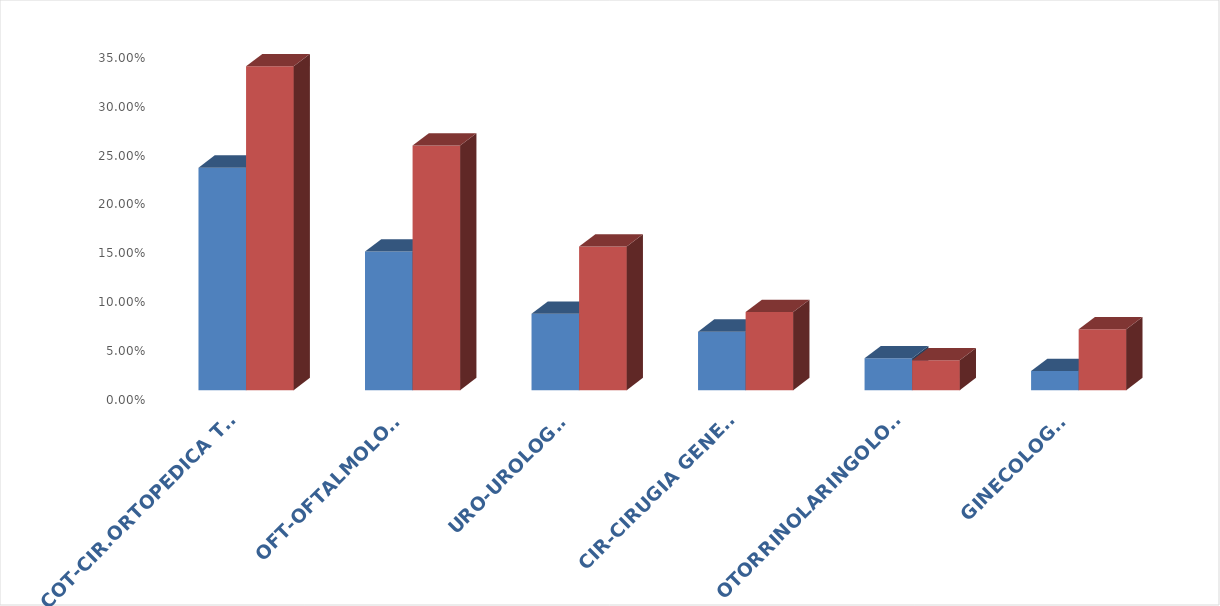
| Category | Series 0 | Series 1 |
|---|---|---|
| COT-CIR.ORTOPEDICA TRAUMA | 0.228 | 0.331 |
| OFT-OFTALMOLOGIA  | 0.142 | 0.25 |
| URO-UROLOGIA  | 0.078 | 0.147 |
| CIR-CIRUGIA GENERAL | 0.06 | 0.08 |
| OTORRINOLARINGOLOGIA | 0.033 | 0.03 |
| GINECOLOGIA | 0.02 | 0.062 |